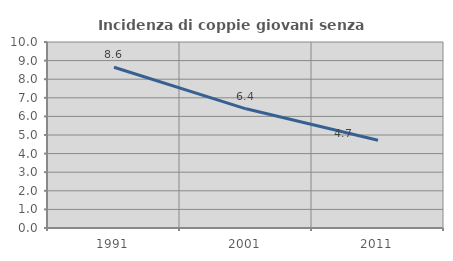
| Category | Incidenza di coppie giovani senza figli |
|---|---|
| 1991.0 | 8.642 |
| 2001.0 | 6.407 |
| 2011.0 | 4.715 |